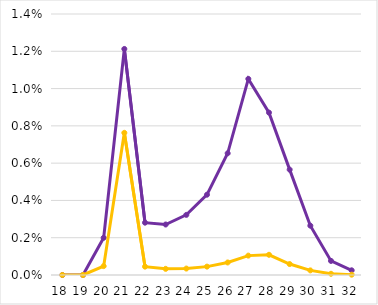
| Category | TE | Virus |
|---|---|---|
| 18.0 | 0 | 0 |
| 19.0 | 0 | 0 |
| 20.0 | 0.002 | 0 |
| 21.0 | 0.012 | 0.008 |
| 22.0 | 0.003 | 0 |
| 23.0 | 0.003 | 0 |
| 24.0 | 0.003 | 0 |
| 25.0 | 0.004 | 0 |
| 26.0 | 0.007 | 0.001 |
| 27.0 | 0.011 | 0.001 |
| 28.0 | 0.009 | 0.001 |
| 29.0 | 0.006 | 0.001 |
| 30.0 | 0.003 | 0 |
| 31.0 | 0.001 | 0 |
| 32.0 | 0 | 0 |